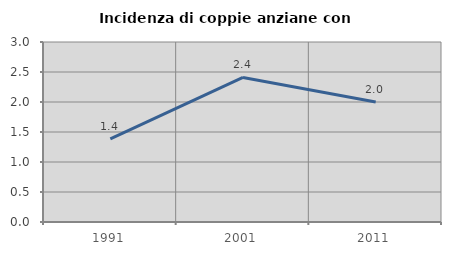
| Category | Incidenza di coppie anziane con figli |
|---|---|
| 1991.0 | 1.384 |
| 2001.0 | 2.41 |
| 2011.0 | 2 |